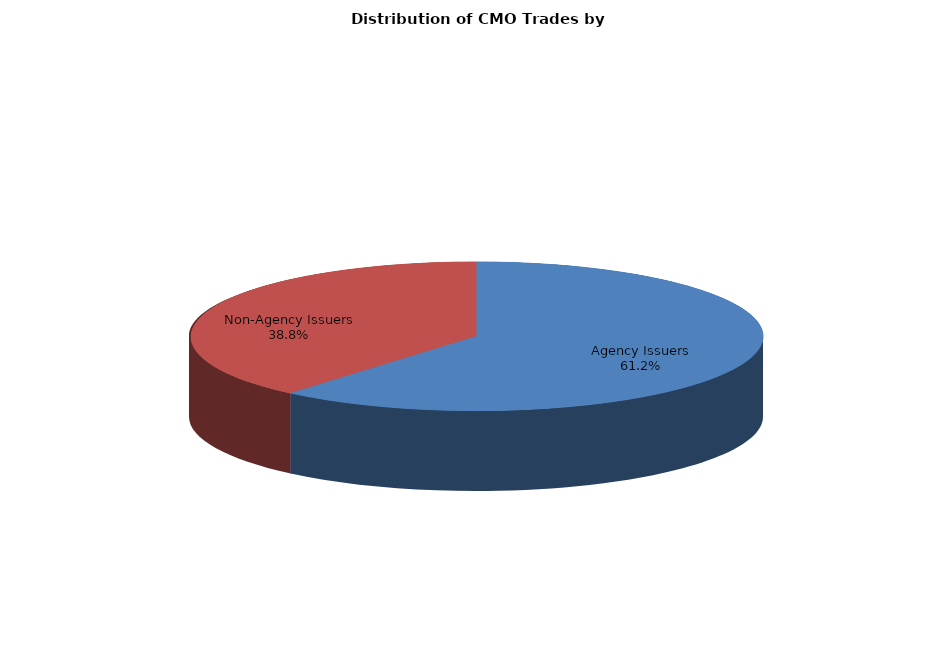
| Category | Series 0 |
|---|---|
| Agency Issuers | 1349.635 |
| Non-Agency Issuers | 856.619 |